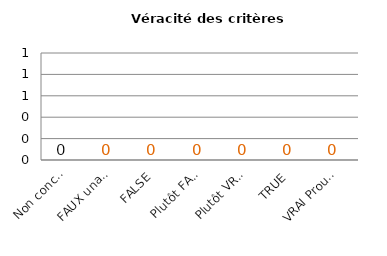
| Category | Series 0 |
|---|---|
| Non concerné | 0 |
| FAUX unanime | 0 |
| FAUX | 0 |
| Plutôt FAUX | 0 |
| Plutôt VRAI | 0 |
| VRAI | 0 |
| VRAI Prouvé | 0 |